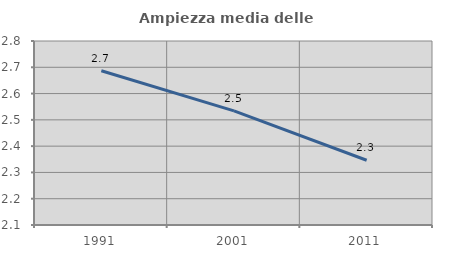
| Category | Ampiezza media delle famiglie |
|---|---|
| 1991.0 | 2.687 |
| 2001.0 | 2.534 |
| 2011.0 | 2.346 |